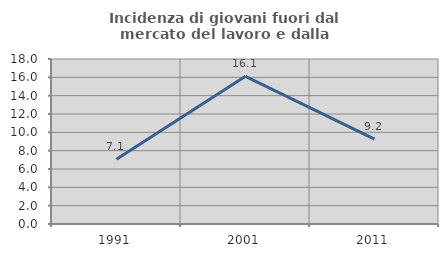
| Category | Incidenza di giovani fuori dal mercato del lavoro e dalla formazione  |
|---|---|
| 1991.0 | 7.051 |
| 2001.0 | 16.114 |
| 2011.0 | 9.249 |